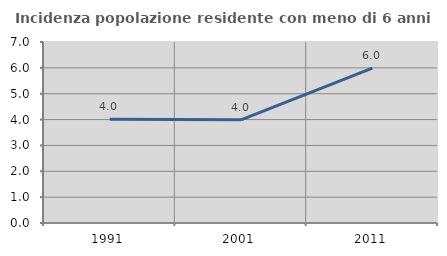
| Category | Incidenza popolazione residente con meno di 6 anni |
|---|---|
| 1991.0 | 4.014 |
| 2001.0 | 3.991 |
| 2011.0 | 5.992 |